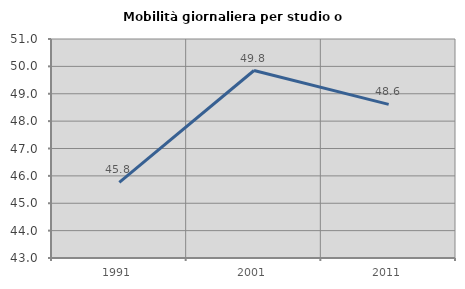
| Category | Mobilità giornaliera per studio o lavoro |
|---|---|
| 1991.0 | 45.763 |
| 2001.0 | 49.849 |
| 2011.0 | 48.611 |